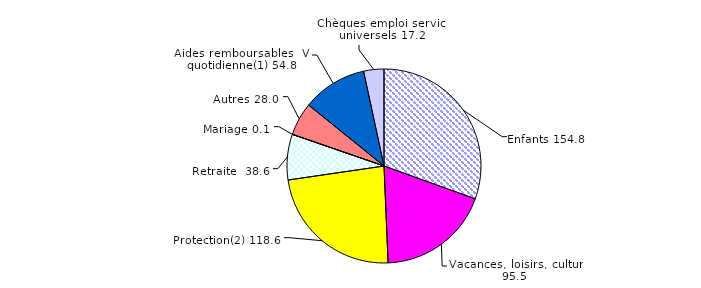
| Category | Series 0 |
|---|---|
| Enfants | 154.818 |
| Vacances, loisirs, culture | 95.538 |
| Protection(2) | 118.558 |
| Retraite  | 38.589 |
| Mariage | 0.063 |
| Autres | 28.02 |
| Aides remboursables  Vie quotidienne(1) | 54.808 |
| Chèques emploi service universels | 17.15 |